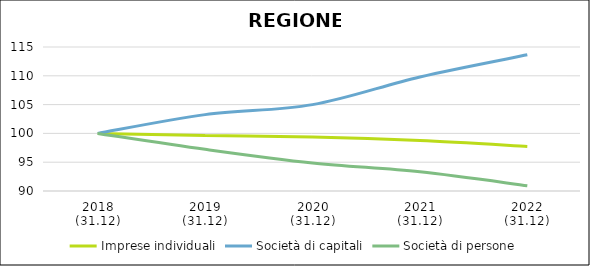
| Category | Imprese individuali | Società di capitali | Società di persone |
|---|---|---|---|
| 2018
(31.12) | 100 | 100 | 100 |
| 2019
(31.12) | 99.656 | 103.261 | 97.237 |
| 2020
(31.12) | 99.378 | 104.995 | 94.864 |
| 2021
(31.12) | 98.751 | 109.806 | 93.327 |
| 2022
(31.12) | 97.733 | 113.644 | 90.91 |